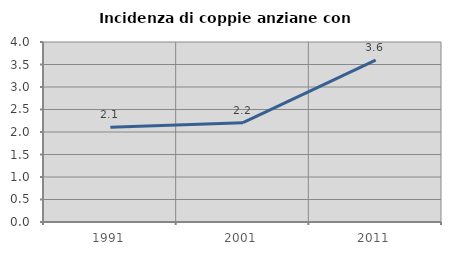
| Category | Incidenza di coppie anziane con figli |
|---|---|
| 1991.0 | 2.104 |
| 2001.0 | 2.207 |
| 2011.0 | 3.596 |